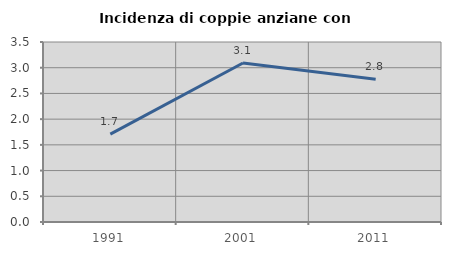
| Category | Incidenza di coppie anziane con figli |
|---|---|
| 1991.0 | 1.709 |
| 2001.0 | 3.092 |
| 2011.0 | 2.778 |